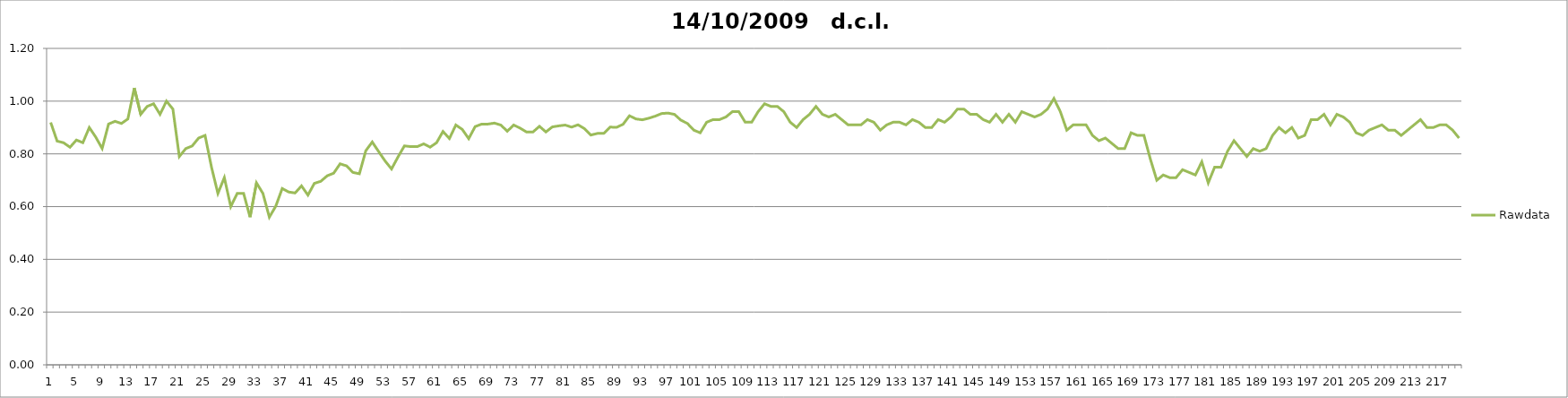
| Category | Rawdata |
|---|---|
| 0 | 0.919 |
| 1 | 0.848 |
| 2 | 0.842 |
| 3 | 0.825 |
| 4 | 0.852 |
| 5 | 0.842 |
| 6 | 0.9 |
| 7 | 0.864 |
| 8 | 0.821 |
| 9 | 0.913 |
| 10 | 0.924 |
| 11 | 0.915 |
| 12 | 0.932 |
| 13 | 1.05 |
| 14 | 0.95 |
| 15 | 0.98 |
| 16 | 0.99 |
| 17 | 0.95 |
| 18 | 1 |
| 19 | 0.97 |
| 20 | 0.79 |
| 21 | 0.82 |
| 22 | 0.83 |
| 23 | 0.86 |
| 24 | 0.87 |
| 25 | 0.75 |
| 26 | 0.65 |
| 27 | 0.71 |
| 28 | 0.6 |
| 29 | 0.65 |
| 30 | 0.65 |
| 31 | 0.56 |
| 32 | 0.69 |
| 33 | 0.65 |
| 34 | 0.56 |
| 35 | 0.602 |
| 36 | 0.669 |
| 37 | 0.656 |
| 38 | 0.652 |
| 39 | 0.679 |
| 40 | 0.644 |
| 41 | 0.688 |
| 42 | 0.696 |
| 43 | 0.717 |
| 44 | 0.727 |
| 45 | 0.762 |
| 46 | 0.755 |
| 47 | 0.73 |
| 48 | 0.725 |
| 49 | 0.812 |
| 50 | 0.845 |
| 51 | 0.809 |
| 52 | 0.773 |
| 53 | 0.743 |
| 54 | 0.788 |
| 55 | 0.83 |
| 56 | 0.828 |
| 57 | 0.828 |
| 58 | 0.838 |
| 59 | 0.826 |
| 60 | 0.842 |
| 61 | 0.885 |
| 62 | 0.858 |
| 63 | 0.91 |
| 64 | 0.893 |
| 65 | 0.858 |
| 66 | 0.904 |
| 67 | 0.913 |
| 68 | 0.913 |
| 69 | 0.917 |
| 70 | 0.909 |
| 71 | 0.886 |
| 72 | 0.91 |
| 73 | 0.898 |
| 74 | 0.883 |
| 75 | 0.883 |
| 76 | 0.905 |
| 77 | 0.883 |
| 78 | 0.902 |
| 79 | 0.906 |
| 80 | 0.909 |
| 81 | 0.902 |
| 82 | 0.91 |
| 83 | 0.896 |
| 84 | 0.872 |
| 85 | 0.878 |
| 86 | 0.878 |
| 87 | 0.902 |
| 88 | 0.901 |
| 89 | 0.912 |
| 90 | 0.945 |
| 91 | 0.933 |
| 92 | 0.929 |
| 93 | 0.935 |
| 94 | 0.943 |
| 95 | 0.953 |
| 96 | 0.955 |
| 97 | 0.95 |
| 98 | 0.928 |
| 99 | 0.916 |
| 100 | 0.89 |
| 101 | 0.88 |
| 102 | 0.92 |
| 103 | 0.93 |
| 104 | 0.93 |
| 105 | 0.94 |
| 106 | 0.96 |
| 107 | 0.96 |
| 108 | 0.92 |
| 109 | 0.92 |
| 110 | 0.96 |
| 111 | 0.99 |
| 112 | 0.98 |
| 113 | 0.98 |
| 114 | 0.96 |
| 115 | 0.92 |
| 116 | 0.9 |
| 117 | 0.93 |
| 118 | 0.95 |
| 119 | 0.98 |
| 120 | 0.95 |
| 121 | 0.94 |
| 122 | 0.95 |
| 123 | 0.93 |
| 124 | 0.91 |
| 125 | 0.91 |
| 126 | 0.91 |
| 127 | 0.93 |
| 128 | 0.92 |
| 129 | 0.89 |
| 130 | 0.91 |
| 131 | 0.92 |
| 132 | 0.92 |
| 133 | 0.91 |
| 134 | 0.93 |
| 135 | 0.92 |
| 136 | 0.9 |
| 137 | 0.9 |
| 138 | 0.93 |
| 139 | 0.92 |
| 140 | 0.94 |
| 141 | 0.97 |
| 142 | 0.97 |
| 143 | 0.95 |
| 144 | 0.95 |
| 145 | 0.93 |
| 146 | 0.92 |
| 147 | 0.95 |
| 148 | 0.92 |
| 149 | 0.95 |
| 150 | 0.92 |
| 151 | 0.96 |
| 152 | 0.95 |
| 153 | 0.94 |
| 154 | 0.95 |
| 155 | 0.97 |
| 156 | 1.01 |
| 157 | 0.96 |
| 158 | 0.89 |
| 159 | 0.91 |
| 160 | 0.91 |
| 161 | 0.91 |
| 162 | 0.87 |
| 163 | 0.85 |
| 164 | 0.86 |
| 165 | 0.84 |
| 166 | 0.82 |
| 167 | 0.82 |
| 168 | 0.88 |
| 169 | 0.87 |
| 170 | 0.87 |
| 171 | 0.78 |
| 172 | 0.7 |
| 173 | 0.72 |
| 174 | 0.71 |
| 175 | 0.71 |
| 176 | 0.74 |
| 177 | 0.73 |
| 178 | 0.72 |
| 179 | 0.77 |
| 180 | 0.69 |
| 181 | 0.75 |
| 182 | 0.75 |
| 183 | 0.81 |
| 184 | 0.85 |
| 185 | 0.82 |
| 186 | 0.79 |
| 187 | 0.82 |
| 188 | 0.81 |
| 189 | 0.82 |
| 190 | 0.87 |
| 191 | 0.9 |
| 192 | 0.88 |
| 193 | 0.9 |
| 194 | 0.86 |
| 195 | 0.87 |
| 196 | 0.93 |
| 197 | 0.93 |
| 198 | 0.95 |
| 199 | 0.91 |
| 200 | 0.95 |
| 201 | 0.94 |
| 202 | 0.92 |
| 203 | 0.88 |
| 204 | 0.87 |
| 205 | 0.89 |
| 206 | 0.9 |
| 207 | 0.91 |
| 208 | 0.89 |
| 209 | 0.89 |
| 210 | 0.87 |
| 211 | 0.89 |
| 212 | 0.91 |
| 213 | 0.93 |
| 214 | 0.9 |
| 215 | 0.9 |
| 216 | 0.91 |
| 217 | 0.91 |
| 218 | 0.89 |
| 219 | 0.86 |